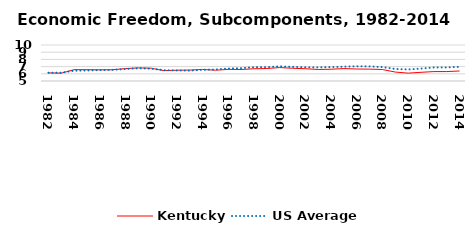
| Category | Kentucky | US Average |
|---|---|---|
| 1982.0 | 6.124 | 6.149 |
| 1983.0 | 6.088 | 6.152 |
| 1984.0 | 6.574 | 6.429 |
| 1985.0 | 6.573 | 6.464 |
| 1986.0 | 6.55 | 6.512 |
| 1987.0 | 6.565 | 6.552 |
| 1988.0 | 6.722 | 6.659 |
| 1989.0 | 6.824 | 6.767 |
| 1990.0 | 6.776 | 6.71 |
| 1991.0 | 6.435 | 6.502 |
| 1992.0 | 6.498 | 6.463 |
| 1993.0 | 6.517 | 6.446 |
| 1994.0 | 6.605 | 6.563 |
| 1995.0 | 6.501 | 6.593 |
| 1996.0 | 6.613 | 6.73 |
| 1997.0 | 6.599 | 6.781 |
| 1998.0 | 6.698 | 6.926 |
| 1999.0 | 6.736 | 6.925 |
| 2000.0 | 6.868 | 7.031 |
| 2001.0 | 6.771 | 6.969 |
| 2002.0 | 6.706 | 6.912 |
| 2003.0 | 6.598 | 6.892 |
| 2004.0 | 6.638 | 6.934 |
| 2005.0 | 6.724 | 6.99 |
| 2006.0 | 6.666 | 7.048 |
| 2007.0 | 6.648 | 7.028 |
| 2008.0 | 6.596 | 6.935 |
| 2009.0 | 6.239 | 6.668 |
| 2010.0 | 6.09 | 6.605 |
| 2011.0 | 6.207 | 6.72 |
| 2012.0 | 6.307 | 6.883 |
| 2013.0 | 6.31 | 6.881 |
| 2014.0 | 6.392 | 6.973 |